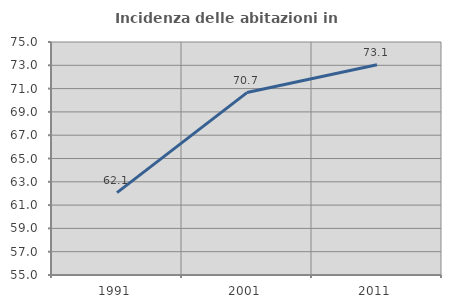
| Category | Incidenza delle abitazioni in proprietà  |
|---|---|
| 1991.0 | 62.069 |
| 2001.0 | 70.659 |
| 2011.0 | 73.054 |